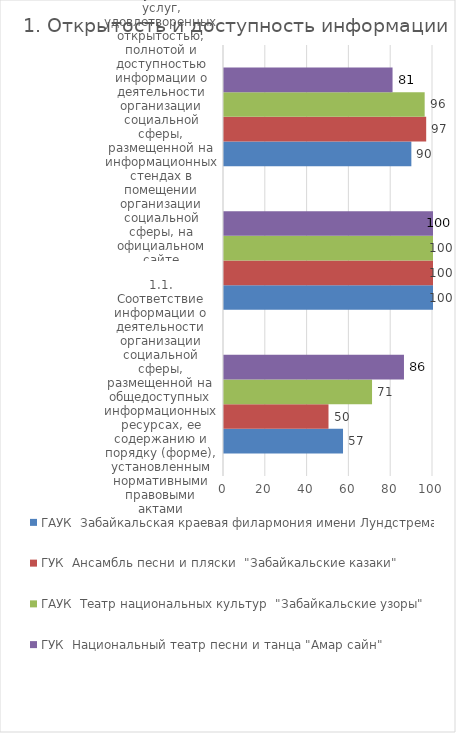
| Category | ГАУК  Забайкальская краевая филармония имени Лундстрема  | ГУК  Ансамбль песни и пляски  "Забайкальские казаки" | ГАУК  Театр национальных культур  "Забайкальские узоры" | ГУК  Национальный театр песни и танца "Амар сайн" |
|---|---|---|---|---|
| 1.1. Соответствие информации о деятельности организации социальной сферы, размещенной на общедоступных информационных ресурсах, ее содержанию и порядку (форме), установленным нормативными правовыми актами | 56.944 | 50 | 70.833 | 86.111 |
| 1.2. Наличие на официальном сайте организации социальной сферы информации о дистанционных способах обратной связи и взаимодействия с получателями услуг и их функционирование | 100 | 100 | 100 | 100 |
| 1.3. Доля получателей услуг, удовлетворенных открытостью, полнотой и доступностью информации о деятельности организации социальной сферы, размещенной на информационных стендах в помещении организации социальной сферы, на официальном сайте организации соци | 89.644 | 96.741 | 96.016 | 80.648 |